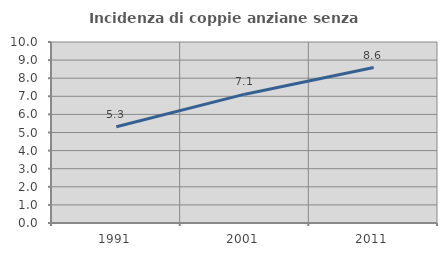
| Category | Incidenza di coppie anziane senza figli  |
|---|---|
| 1991.0 | 5.319 |
| 2001.0 | 7.118 |
| 2011.0 | 8.59 |